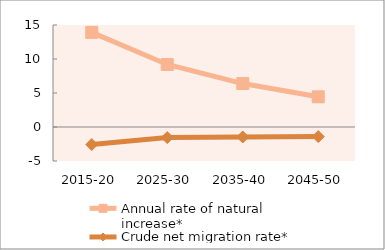
| Category | Annual rate of natural increase* | Crude net migration rate* |
|---|---|---|
| 2015-20 | 13.914 | -2.575 |
| 2025-30 | 9.193 | -1.56 |
| 2035-40 | 6.388 | -1.467 |
| 2045-50 | 4.442 | -1.41 |